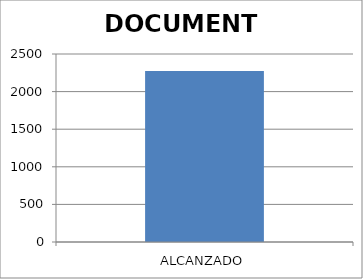
| Category | DOCUMENTO |
|---|---|
| ALCANZADO | 2275 |